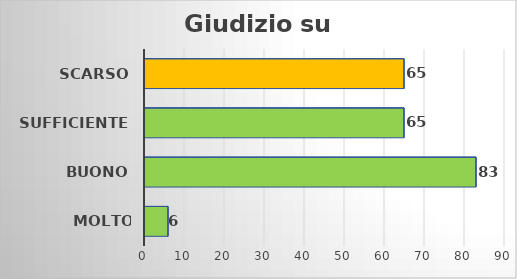
| Category | Giudizio su sanità |
|---|---|
| Molto buono | 6 |
| Buono | 83 |
| Sufficiente | 65 |
| Scarso | 65 |